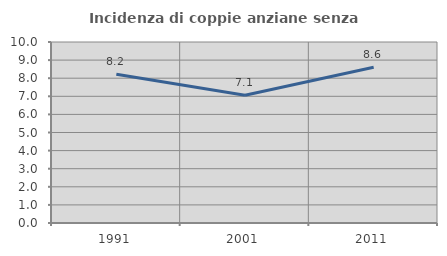
| Category | Incidenza di coppie anziane senza figli  |
|---|---|
| 1991.0 | 8.219 |
| 2001.0 | 7.059 |
| 2011.0 | 8.602 |